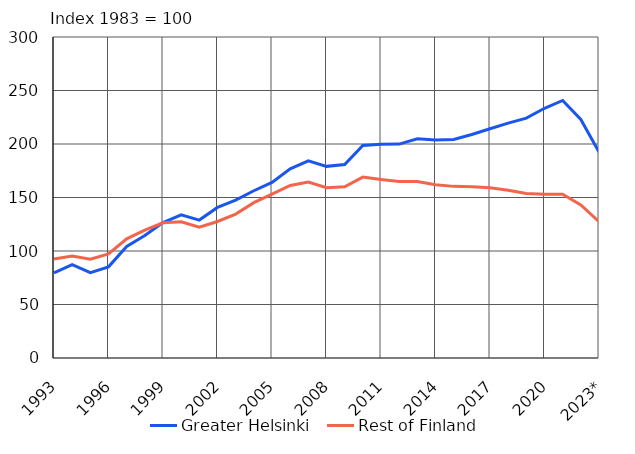
| Category | Greater Helsinki | Rest of Finland |
|---|---|---|
| 1993 | 79.6 | 92.5 |
| 1994 | 87.2 | 95.2 |
| 1995 | 79.8 | 92.4 |
| 1996 | 85.2 | 97.2 |
| 1997 | 104.2 | 111.4 |
| 1998 | 114.4 | 119.6 |
| 1999 | 126.6 | 126.4 |
| 2000 | 133.8 | 127.3 |
| 2001 | 128.9 | 122.2 |
| 2002 | 140.7 | 127.6 |
| 2003 | 147.6 | 134.5 |
| 2004 | 156.3 | 145.2 |
| 2005 | 164.1 | 153.1 |
| 2006 | 176.8 | 161.3 |
| 2007 | 184.2 | 164.5 |
| 2008 | 179.1 | 159.1 |
| 2009 | 180.8 | 160 |
| 2010 | 198.6 | 169.1 |
| 2011 | 199.8 | 166.9 |
| 2012 | 199.9 | 165 |
| 2013 | 204.8 | 165 |
| 2014 | 203.7 | 161.9 |
| 2015 | 204.3 | 160.4 |
| 2016 | 208.9 | 160.1 |
| 2017 | 214.2 | 159.2 |
| 2018 | 219.5 | 156.8 |
| 2019 | 224.2 | 153.8 |
| 2020 | 233.4 | 153.1 |
| 2021 | 240.7 | 153.1 |
| 2022 | 222.9 | 143 |
| 2023* | 192.5 | 127.4 |